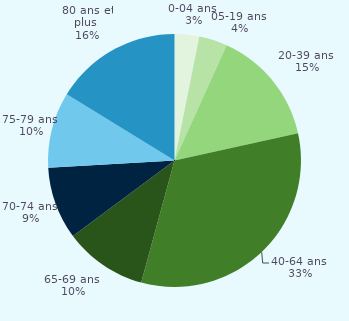
| Category | Series 0 |
|---|---|
| 0-04 ans  | 0.031 |
| 05-19 ans  | 0.036 |
| 20-39 ans  | 0.148 |
| 40-64 ans  | 0.327 |
| 65-69 ans  | 0.106 |
| 70-74 ans  | 0.093 |
| 75-79 ans  | 0.097 |
| 80 ans et plus  | 0.162 |